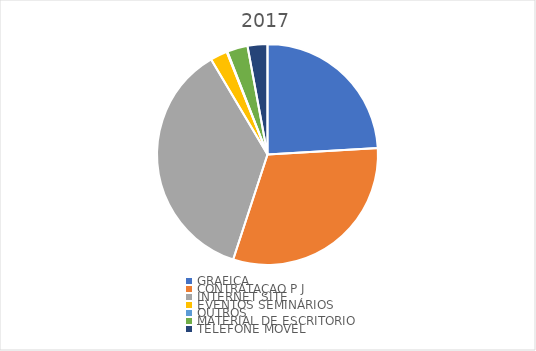
| Category | Series 0 |
|---|---|
| GRAFICA | 60545.12 |
| CONTRATAÇAO P J | 77837.8 |
| INTERNET SITE | 91666.94 |
| EVENTOS SEMINÁRIOS | 6299 |
| OUTROS | 242.5 |
| MATERIAL DE ESCRITORIO | 7578.49 |
| TELEFONE MOVEL | 7308.04 |